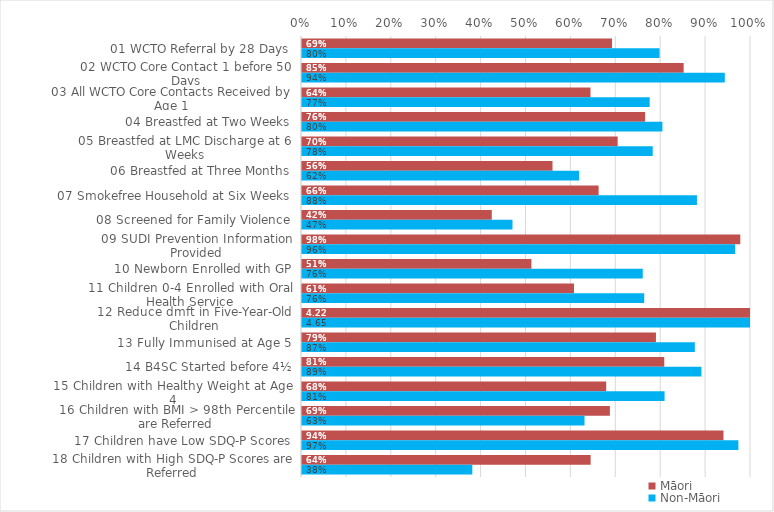
| Category | Māori | Non-Māori |
|---|---|---|
| 01 WCTO Referral by 28 Days | 0.69 | 0.796 |
| 02 WCTO Core Contact 1 before 50 Days | 0.85 | 0.942 |
| 03 All WCTO Core Contacts Received by Age 1 | 0.643 | 0.774 |
| 04 Breastfed at Two Weeks | 0.764 | 0.803 |
| 05 Breastfed at LMC Discharge at 6 Weeks | 0.703 | 0.781 |
| 06 Breastfed at Three Months | 0.558 | 0.617 |
| 07 Smokefree Household at Six Weeks | 0.661 | 0.88 |
| 08 Screened for Family Violence | 0.423 | 0.469 |
| 09 SUDI Prevention Information Provided | 0.976 | 0.965 |
| 10 Newborn Enrolled with GP | 0.511 | 0.759 |
| 11 Children 0-4 Enrolled with Oral Health Service | 0.606 | 0.762 |
| 12 Reduce dmft in Five-Year-Old Children | 4.222 | 4.65 |
| 13 Fully Immunised at Age 5 | 0.788 | 0.875 |
| 14 B4SC Started before 4½ | 0.807 | 0.89 |
| 15 Children with Healthy Weight at Age 4 | 0.678 | 0.808 |
| 16 Children with BMI > 98th Percentile are Referred | 0.686 | 0.629 |
| 17 Children have Low SDQ-P Scores | 0.939 | 0.972 |
| 18 Children with High SDQ-P Scores are Referred | 0.643 | 0.379 |